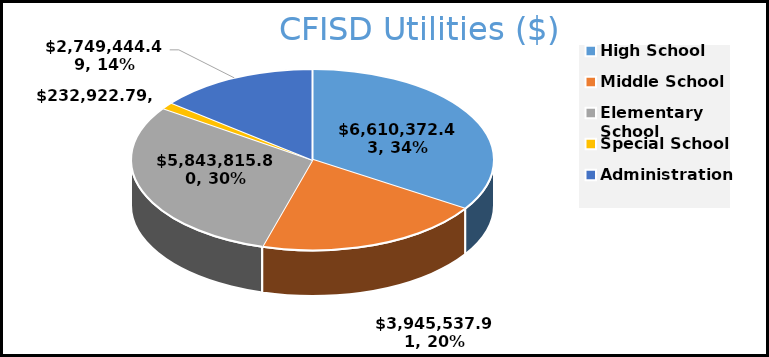
| Category | Total |
|---|---|
| High School | 6610372.43 |
| Middle School | 3945537.91 |
| Elementary School | 5843815.8 |
| Special School | 232922.79 |
| Administration | 2749444.49 |